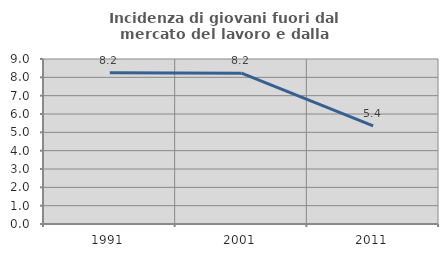
| Category | Incidenza di giovani fuori dal mercato del lavoro e dalla formazione  |
|---|---|
| 1991.0 | 8.244 |
| 2001.0 | 8.224 |
| 2011.0 | 5.357 |